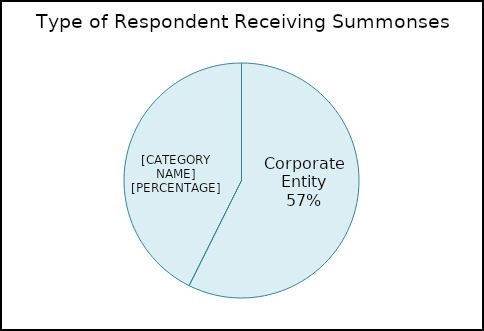
| Category | Series 0 |
|---|---|
| Corporate Entity | 1033 |
| Individual | 768 |